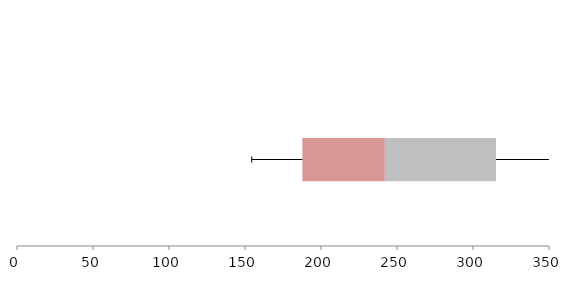
| Category | Series 1 | Series 2 | Series 3 |
|---|---|---|---|
| 0 | 187.718 | 54.29 | 73.108 |